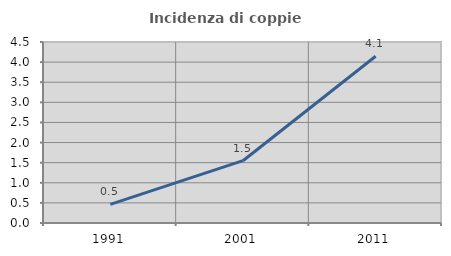
| Category | Incidenza di coppie miste |
|---|---|
| 1991.0 | 0.464 |
| 2001.0 | 1.549 |
| 2011.0 | 4.147 |